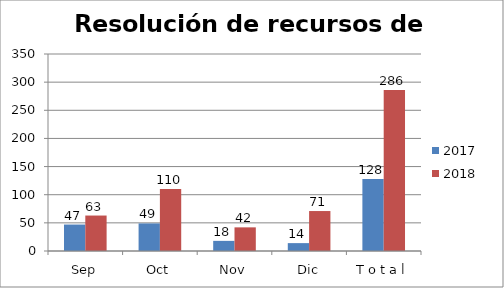
| Category | 2017 | 2018 |
|---|---|---|
| Sep | 47 | 63 |
| Oct | 49 | 110 |
| Nov | 18 | 42 |
| Dic | 14 | 71 |
| T o t a l | 128 | 286 |